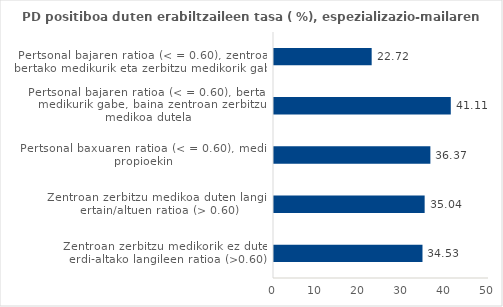
| Category | Series 0 |
|---|---|
| Zentroan zerbitzu medikorik ez duten erdi-altako langileen ratioa (>0.60) | 34.532 |
| Zentroan zerbitzu medikoa duten langile ertain/altuen ratioa (> 0.60) | 35.035 |
| Pertsonal baxuaren ratioa (< = 0.60), mediku propioekin | 36.367 |
| Pertsonal bajaren ratioa (< = 0.60), bertako medikurik gabe, baina zentroan zerbitzu medikoa dutela | 41.113 |
| 
Pertsonal bajaren ratioa (< = 0.60), zentroan bertako medikurik eta zerbitzu medikorik gabe | 22.715 |